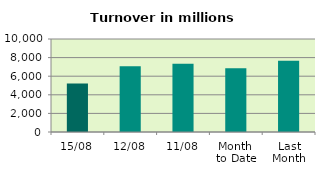
| Category | Series 0 |
|---|---|
| 15/08 | 5208.792 |
| 12/08 | 7064.888 |
| 11/08 | 7330.829 |
| Month 
to Date | 6846.152 |
| Last
Month | 7648.819 |